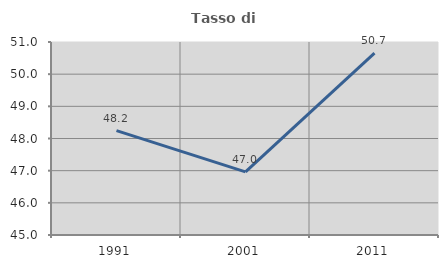
| Category | Tasso di occupazione   |
|---|---|
| 1991.0 | 48.244 |
| 2001.0 | 46.963 |
| 2011.0 | 50.652 |